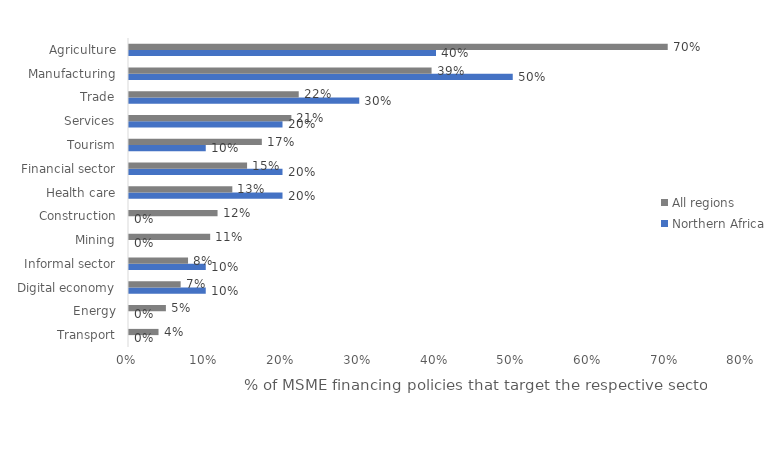
| Category | Northern Africa | All regions |
|---|---|---|
| Transport | 0 | 0.038 |
| Energy | 0 | 0.048 |
| Digital economy | 0.1 | 0.067 |
| Informal sector | 0.1 | 0.077 |
| Mining | 0 | 0.106 |
| Construction | 0 | 0.115 |
| Health care | 0.2 | 0.135 |
| Financial sector | 0.2 | 0.154 |
| Tourism | 0.1 | 0.173 |
| Services | 0.2 | 0.212 |
| Trade | 0.3 | 0.221 |
| Manufacturing | 0.5 | 0.394 |
| Agriculture | 0.4 | 0.702 |